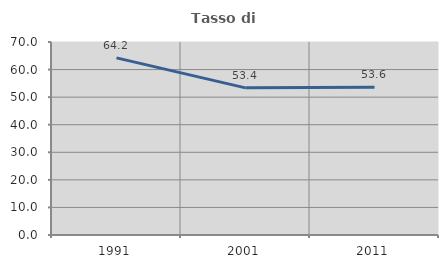
| Category | Tasso di occupazione   |
|---|---|
| 1991.0 | 64.246 |
| 2001.0 | 53.374 |
| 2011.0 | 53.571 |